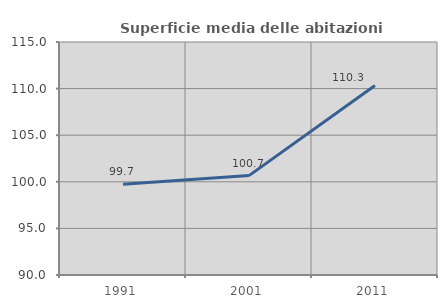
| Category | Superficie media delle abitazioni occupate |
|---|---|
| 1991.0 | 99.727 |
| 2001.0 | 100.664 |
| 2011.0 | 110.324 |